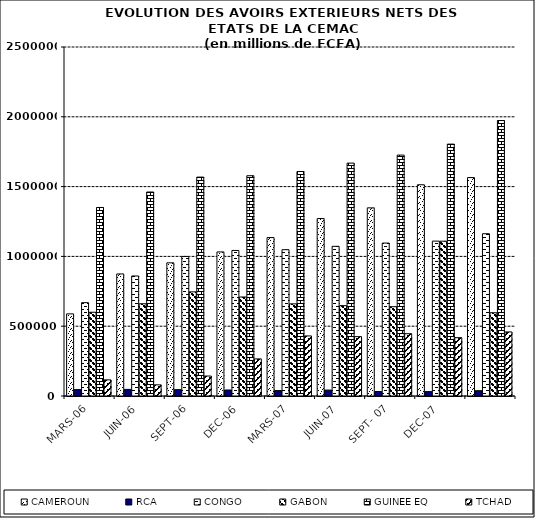
| Category | CAMEROUN | RCA | CONGO | GABON | GUINEE EQ | TCHAD |
|---|---|---|---|---|---|---|
| MARS-06 | 588306 | 45887 | 668757 | 599881 | 1350415 | 115456 |
| JUIN-06 | 874415 | 47364 | 859810 | 660769 | 1461268 | 79906 |
| SEPT-06 | 953928 | 45534 | 999577 | 745941 | 1568002 | 143111 |
| DEC-06 | 1031904 | 42989 | 1042569 | 709257 | 1577990 | 265728 |
| MARS-07 | 1134884 | 38802 | 1048059 | 660083 | 1608139 | 430287 |
| JUIN-07 | 1271084 | 42460 | 1072116 | 647276 | 1668188 | 425241 |
| SEPT- 07 | 1347667 | 32023 | 1095472 | 639852 | 1725777 | 446174 |
| DEC-07 | 1513195 | 31552 | 1109504 | 1108897 | 1804294 | 417823 |